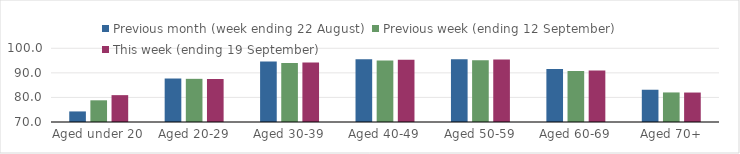
| Category | Previous month (week ending 22 August) | Previous week (ending 12 September) | This week (ending 19 September) |
|---|---|---|---|
| Aged under 20 | 74.3 | 78.83 | 80.93 |
| Aged 20-29 | 87.7 | 87.57 | 87.49 |
| Aged 30-39 | 94.63 | 94 | 94.18 |
| Aged 40-49 | 95.58 | 95.02 | 95.38 |
| Aged 50-59 | 95.57 | 95.14 | 95.46 |
| Aged 60-69 | 91.56 | 90.8 | 90.94 |
| Aged 70+ | 83.13 | 82.03 | 81.99 |